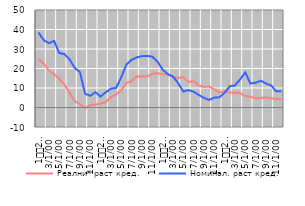
| Category | Реални* раст кред. | Номинал. раст кред. |
|---|---|---|
| 1
2009. | 24.971 | 38.434 |
| 2 | 22.527 | 34.499 |
| 3 | 18.975 | 32.953 |
| 4 | 17.157 | 34.161 |
| 5 | 14.745 | 27.918 |
| 6 | 11.805 | 27.403 |
| 7 | 7.496 | 24.646 |
| 8 | 3.243 | 20.261 |
| 9 | 1.655 | 18.17 |
| 10 | -0.331 | 7.08 |
| 11 | 1.319 | 5.983 |
| 12 | 1.443 | 7.836 |
| 1
2010. | 2.002 | 5.626 |
| 2 | 2.806 | 7.796 |
| 3 | 5.321 | 9.674 |
| 4 | 6.719 | 10.046 |
| 5 | 8.845 | 15.496 |
| 6 | 12.692 | 22.044 |
| 7 | 13.555 | 24.414 |
| 8 | 15.914 | 25.72 |
| 9 | 15.949 | 26.33 |
| 10 | 15.955 | 26.467 |
| 11 | 17.247 | 26.058 |
| 12 | 17.569 | 23.568 |
| 1
2011. | 17.067 | 19.491 |
| 2 | 17.037 | 17.078 |
| 3 | 15.895 | 15.921 |
| 4 | 15.085 | 12.529 |
| 5 | 15.631 | 8.217 |
| 6 | 13.081 | 8.949 |
| 7 | 13.533 | 8.103 |
| 8 | 11.206 | 6.448 |
| 9 | 10.604 | 4.927 |
| 10 | 10.773 | 3.903 |
| 11 | 9.325 | 5.091 |
| 12 | 7.737 | 5.245 |
| 1
2012. | 8.298 | 7.55 |
| 2 | 7.661 | 10.867 |
| 3 | 7.578 | 11.26 |
| 4 | 7.372 | 14.416 |
| 5 | 5.872 | 17.997 |
| 6 | 5.513 | 12.307 |
| 7 | 4.735 | 12.694 |
| 8 | 4.823 | 13.752 |
| 9 | 5.156 | 12.307 |
| 10 | 4.7 | 11.342 |
| 11 | 4.389 | 8.282 |
| 12 | 4.157 | 8.383 |